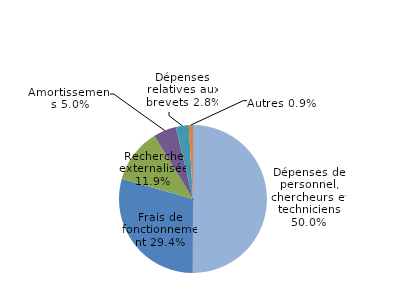
| Category | Series 0 |
|---|---|
| Dépenses de personnel, chercheurs et techniciens | 0.5 |
| Frais de fonctionnement | 0.294 |
| Recherche externalisée | 0.119 |
| Amortissements | 0.05 |
| Dépenses relatives aux brevets | 0.028 |
| Autres | 0.009 |